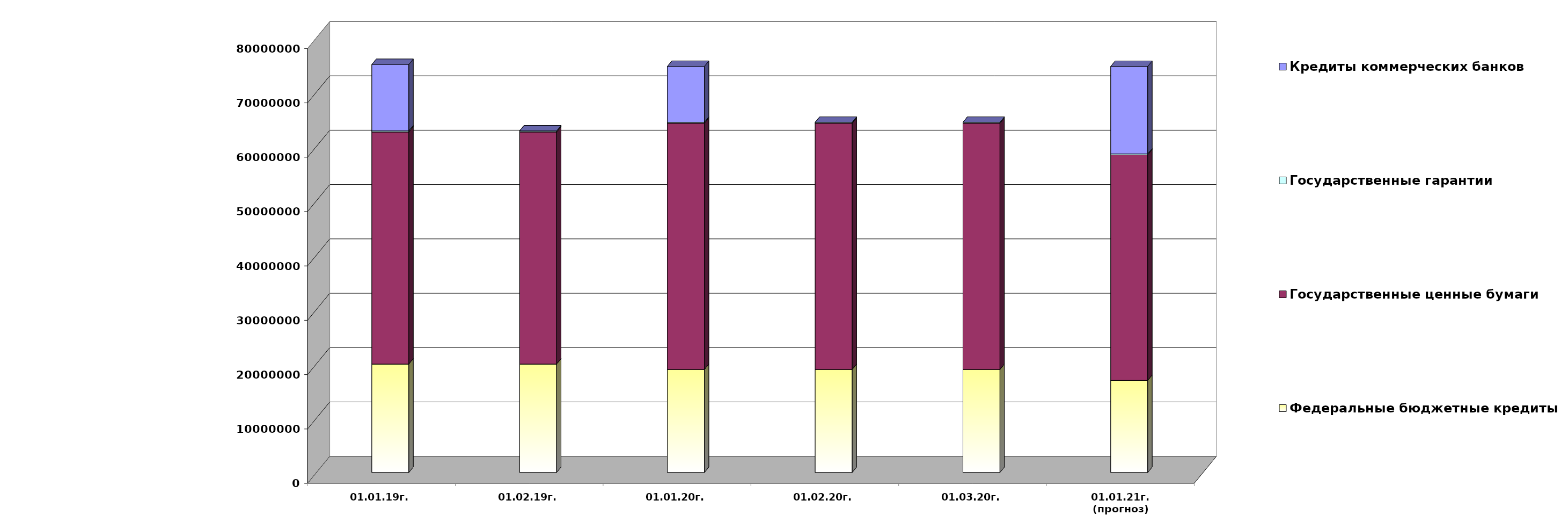
| Category | Федеральные бюджетные кредиты | Государственные ценные бумаги  | Государственные гарантии | Кредиты коммерческих банков |
|---|---|---|---|---|
| 01.01.19г. | 19957026.213 | 42700000 | 209872.86 | 12219963.75 |
| 01.02.19г. | 19957026.213 | 42700000 | 200735.86 | 0 |
| 01.01.20г. | 18954967.463 | 45300000 | 186330.02 | 10291177 |
| 01.02.20г. | 18954967.463 | 45300000 | 184738.25 | 0 |
| 01.03.20г. | 18954967.463 | 45300000 | 184738.25 | 0 |
| 01.01.21г.
(прогноз) | 16950850 | 41500000 | 179496.4 | 16097210.1 |